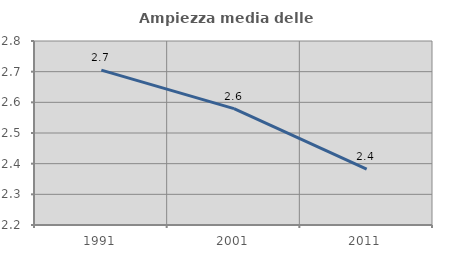
| Category | Ampiezza media delle famiglie |
|---|---|
| 1991.0 | 2.705 |
| 2001.0 | 2.579 |
| 2011.0 | 2.382 |